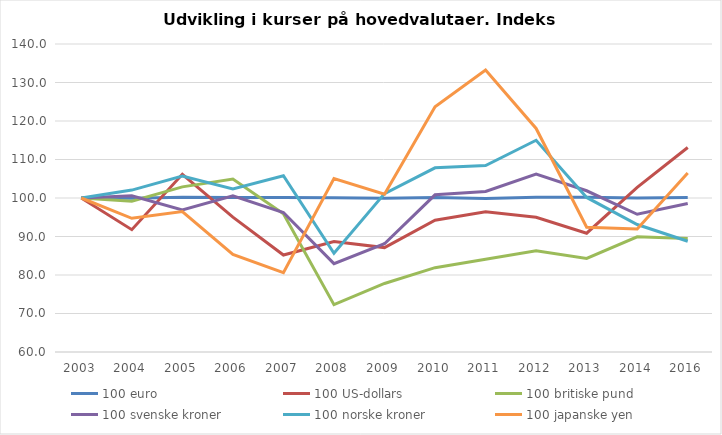
| Category | 100 euro | 100 US-dollars | 100 britiske pund | 100 svenske kroner | 100 norske kroner | 100 japanske yen |
|---|---|---|---|---|---|---|
| 2003.0 | 100 | 100 | 100 | 100 | 100 | 100 |
| 2004.0 | 99.913 | 91.775 | 99.18 | 100.585 | 102.059 | 94.734 |
| 2005.0 | 100.214 | 106.152 | 102.89 | 96.879 | 105.678 | 96.476 |
| 2006.0 | 100.153 | 95.028 | 104.941 | 100.549 | 102.375 | 85.341 |
| 2007.0 | 100.161 | 85.19 | 95.909 | 96.22 | 105.769 | 80.621 |
| 2008.0 | 100.081 | 88.709 | 72.282 | 82.955 | 85.646 | 105.046 |
| 2009.0 | 99.958 | 87.117 | 77.799 | 88.125 | 101.142 | 100.993 |
| 2010.0 | 100.132 | 94.221 | 81.903 | 100.829 | 107.838 | 123.703 |
| 2011.0 | 99.86 | 96.442 | 84.115 | 101.707 | 108.449 | 133.267 |
| 2012.0 | 100.212 | 94.99 | 86.308 | 106.242 | 114.998 | 118.064 |
| 2013.0 | 100.211 | 90.854 | 84.3 | 101.878 | 100.147 | 92.402 |
| 2014.0 | 99.987 | 102.749 | 89.928 | 95.782 | 93.112 | 91.948 |
| 2016.0 | 100.161 | 113.123 | 89.512 | 98.561 | 88.757 | 106.515 |